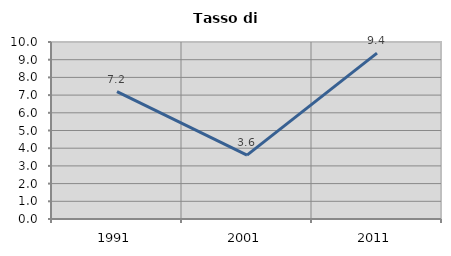
| Category | Tasso di disoccupazione   |
|---|---|
| 1991.0 | 7.192 |
| 2001.0 | 3.61 |
| 2011.0 | 9.375 |